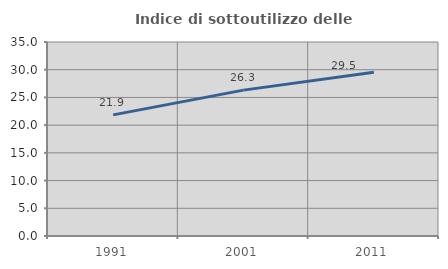
| Category | Indice di sottoutilizzo delle abitazioni  |
|---|---|
| 1991.0 | 21.854 |
| 2001.0 | 26.316 |
| 2011.0 | 29.53 |